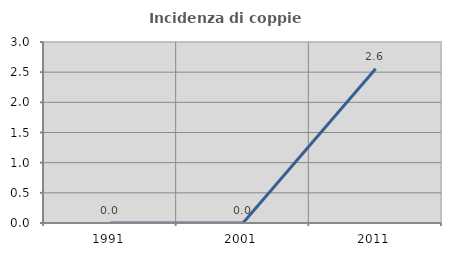
| Category | Incidenza di coppie miste |
|---|---|
| 1991.0 | 0 |
| 2001.0 | 0 |
| 2011.0 | 2.556 |